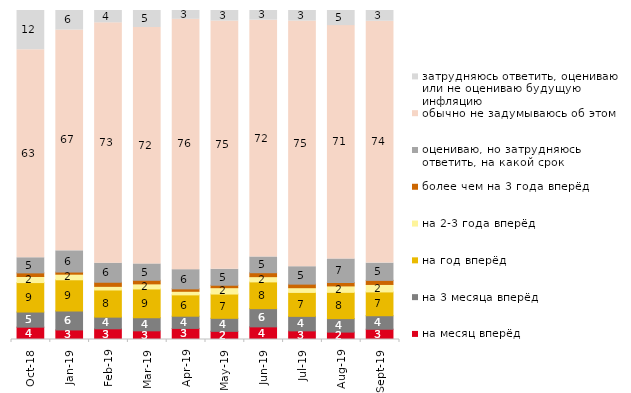
| Category | на месяц вперёд | на 3 месяца вперёд | на год вперёд | на 2-3 года вперёд | более чем на 3 года вперёд | оцениваю, но затрудняюсь ответить, на какой срок | обычно не задумываюсь об этом | затрудняюсь ответить, оцениваю или не оцениваю будущую инфляцию |
|---|---|---|---|---|---|---|---|---|
| 2018-10-01 | 3.75 | 4.6 | 8.95 | 1.85 | 1.1 | 4.6 | 63.2 | 11.95 |
| 2019-01-01 | 2.9 | 5.8 | 9.45 | 1.7 | 0.65 | 6.45 | 67.1 | 5.95 |
| 2019-02-01 | 3.25 | 3.55 | 8.25 | 1.1 | 1.25 | 5.8 | 73.05 | 3.75 |
| 2019-03-01 | 2.636 | 3.978 | 8.752 | 1.542 | 1.094 | 4.973 | 71.855 | 5.172 |
| 2019-04-01 | 3.366 | 3.713 | 6.485 | 1.089 | 0.743 | 5.842 | 76.089 | 2.673 |
| 2019-05-01 | 2.476 | 3.962 | 7.38 | 1.932 | 0.743 | 4.854 | 75.433 | 3.219 |
| 2019-06-01 | 3.84 | 5.536 | 8.13 | 1.596 | 1.197 | 4.788 | 71.97 | 2.943 |
| 2019-07-01 | 2.624 | 4.406 | 7.277 | 1.436 | 1.089 | 5.297 | 74.653 | 3.218 |
| 2019-08-01 | 2.248 | 4.096 | 7.992 | 1.948 | 1.049 | 7.143 | 70.929 | 4.595 |
| 2019-09-01 | 3.119 | 4.109 | 7.228 | 2.277 | 1.238 | 5.248 | 73.515 | 3.267 |